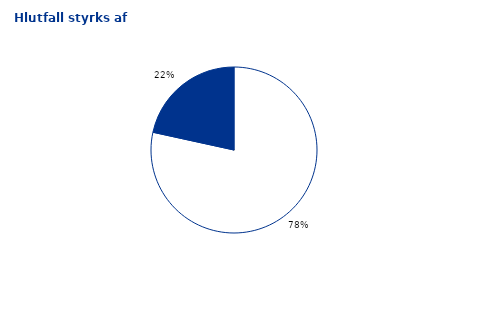
| Category | Series 0 |
|---|---|
| 0 | 60000000 |
| 1 | 16500000 |